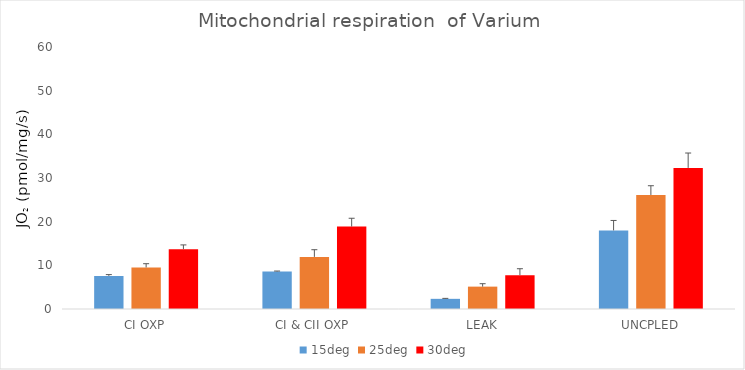
| Category | 15deg | 25deg | 30deg |
|---|---|---|---|
| CI OXP | 7.579 | 9.514 | 13.709 |
| CI & CII OXP | 8.578 | 11.931 | 18.879 |
| LEAK | 2.328 | 5.124 | 7.746 |
| UNCPLED | 17.999 | 26.117 | 32.313 |